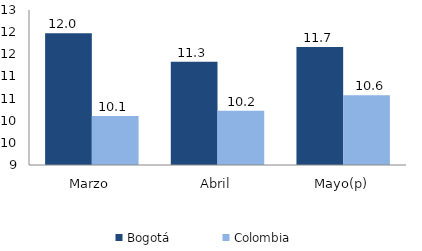
| Category | Bogotá | Colombia |
|---|---|---|
| Marzo | 11.974 | 10.104 |
| Abril | 11.334 | 10.226 |
| Mayo(p) | 11.666 | 10.576 |